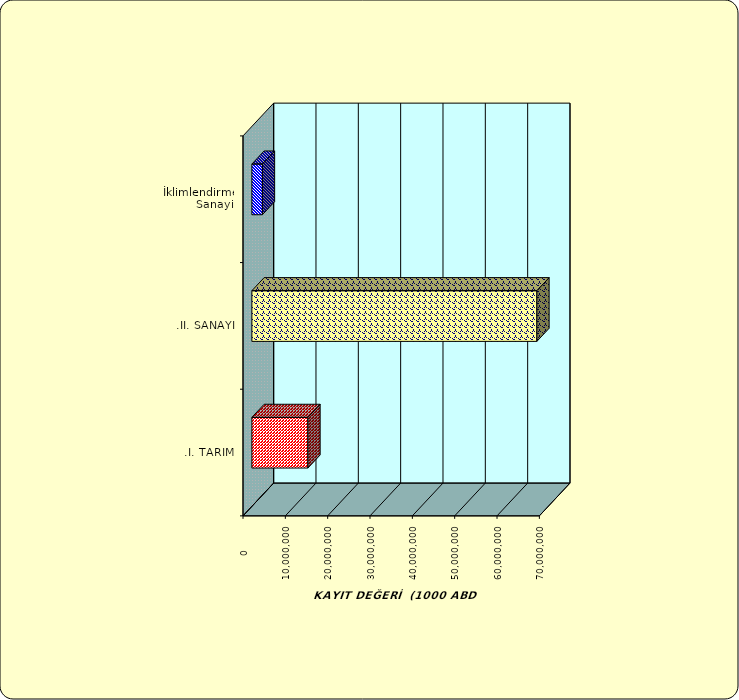
| Category | Series 0 |
|---|---|
| .I. TARIM | 13236436.461 |
| .II. SANAYİ | 67319766.874 |
|  İklimlendirme Sanayii | 2486472.538 |